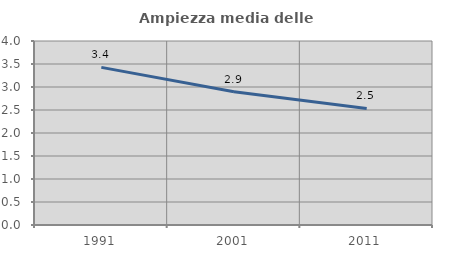
| Category | Ampiezza media delle famiglie |
|---|---|
| 1991.0 | 3.427 |
| 2001.0 | 2.897 |
| 2011.0 | 2.534 |